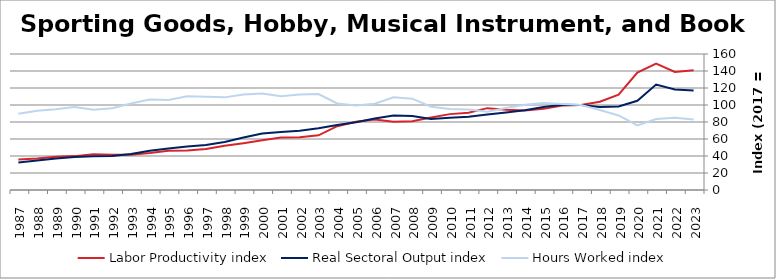
| Category | Labor Productivity index | Real Sectoral Output index | Hours Worked index |
|---|---|---|---|
| 2023.0 | 140.928 | 116.998 | 83.019 |
| 2022.0 | 138.916 | 118.148 | 85.05 |
| 2021.0 | 148.703 | 124.107 | 83.46 |
| 2020.0 | 138.211 | 104.906 | 75.903 |
| 2019.0 | 112.09 | 98.28 | 87.679 |
| 2018.0 | 103.85 | 97.762 | 94.138 |
| 2017.0 | 100 | 100 | 100 |
| 2016.0 | 99.363 | 100.419 | 101.063 |
| 2015.0 | 95.45 | 97.735 | 102.394 |
| 2014.0 | 93.461 | 93.733 | 100.291 |
| 2013.0 | 94.494 | 91.252 | 96.568 |
| 2012.0 | 96.307 | 88.77 | 92.174 |
| 2011.0 | 90.969 | 86.097 | 94.645 |
| 2010.0 | 89.268 | 85.142 | 95.378 |
| 2009.0 | 85.304 | 83.55 | 97.944 |
| 2008.0 | 81.015 | 87.068 | 107.471 |
| 2007.0 | 80.375 | 87.74 | 109.164 |
| 2006.0 | 82.898 | 84.069 | 101.412 |
| 2005.0 | 80.201 | 79.714 | 99.393 |
| 2004.0 | 75.042 | 76.446 | 101.87 |
| 2003.0 | 64.33 | 72.662 | 112.952 |
| 2002.0 | 62.189 | 69.802 | 112.241 |
| 2001.0 | 61.815 | 68.258 | 110.422 |
| 2000.0 | 58.531 | 66.468 | 113.56 |
| 1999.0 | 55.025 | 61.814 | 112.337 |
| 1998.0 | 51.927 | 56.587 | 108.974 |
| 1997.0 | 48.32 | 53.047 | 109.782 |
| 1996.0 | 46.519 | 51.254 | 110.18 |
| 1995.0 | 46.134 | 48.851 | 105.89 |
| 1994.0 | 43.417 | 46.214 | 106.442 |
| 1993.0 | 41.553 | 42.259 | 101.698 |
| 1992.0 | 41.58 | 39.982 | 96.158 |
| 1991.0 | 41.961 | 39.626 | 94.435 |
| 1990.0 | 39.854 | 38.958 | 97.751 |
| 1989.0 | 39.087 | 37.091 | 94.894 |
| 1988.0 | 37.166 | 34.648 | 93.225 |
| 1987.0 | 35.956 | 32.25 | 89.695 |